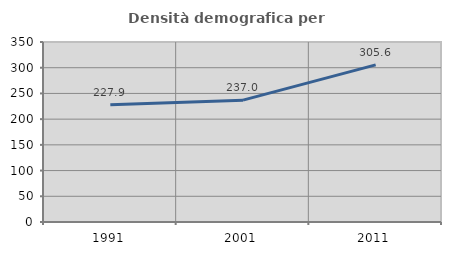
| Category | Densità demografica |
|---|---|
| 1991.0 | 227.86 |
| 2001.0 | 236.959 |
| 2011.0 | 305.613 |